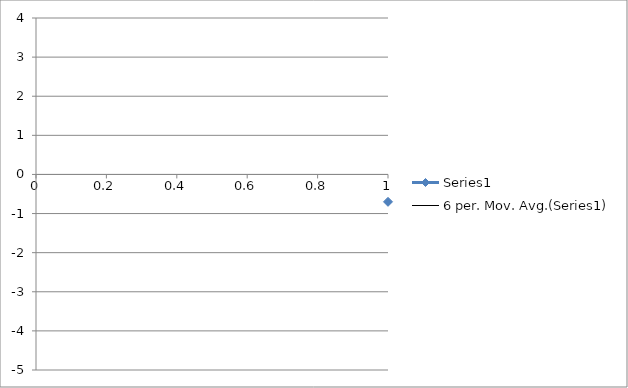
| Category | Series 0 |
|---|---|
| 0 | -0.7 |
| 1 | 3.2 |
| 2 | 1.7 |
| 3 | -3.9 |
| 4 | -0.6 |
| 5 | -0.4 |
| 6 | 1.9 |
| 7 | -0.3 |
| 8 | 2.5 |
| 9 | -0.7 |
| 10 | -0.9 |
| 11 | 1.7 |
| 12 | 1.3 |
| 13 | -2.2 |
| 14 | 0.2 |
| 15 | 1.5 |
| 16 | -0.3 |
| 17 | -1.3 |
| 18 | 1 |
| 19 | 2.3 |
| 20 | -1 |
| 21 | -1.6 |
| 22 | 2.3 |
| 23 | 0.4 |
| 24 | 1 |
| 25 | -0.1 |
| 26 | -0.8 |
| 27 | 0.3 |
| 28 | -0.6 |
| 29 | 1.4 |